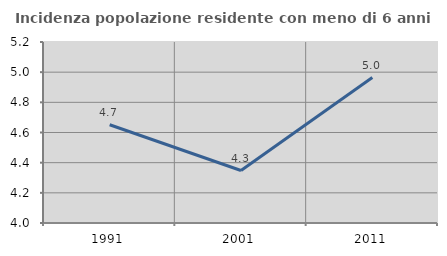
| Category | Incidenza popolazione residente con meno di 6 anni |
|---|---|
| 1991.0 | 4.651 |
| 2001.0 | 4.348 |
| 2011.0 | 4.965 |